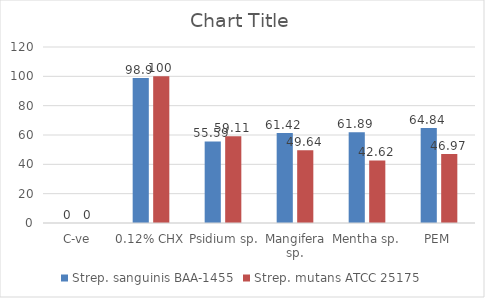
| Category | Strep. sanguinis BAA-1455 | Strep. mutans ATCC 25175 |
|---|---|---|
| C-ve | 0 | 0 |
| 0.12% CHX | 98.9 | 100 |
| Psidium sp. | 55.59 | 59.11 |
| Mangifera sp. | 61.42 | 49.64 |
| Mentha sp. | 61.89 | 42.62 |
| PEM | 64.84 | 46.97 |